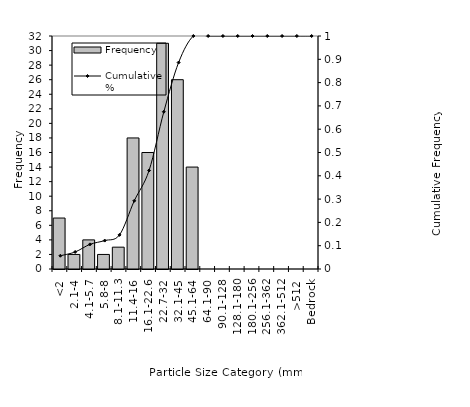
| Category | Frequency |
|---|---|
| <2 | 7 |
| 2.1-4 | 2 |
| 4.1-5.7 | 4 |
| 5.8-8 | 2 |
| 8.1-11.3 | 3 |
| 11.4-16 | 18 |
| 16.1-22.6 | 16 |
| 22.7-32 | 31 |
| 32.1-45 | 26 |
| 45.1-64 | 14 |
| 64.1-90 | 0 |
| 90.1-128 | 0 |
| 128.1-180 | 0 |
| 180.1-256 | 0 |
| 256.1-362 | 0 |
| 362.1-512 | 0 |
| >512 | 0 |
| Bedrock | 0 |